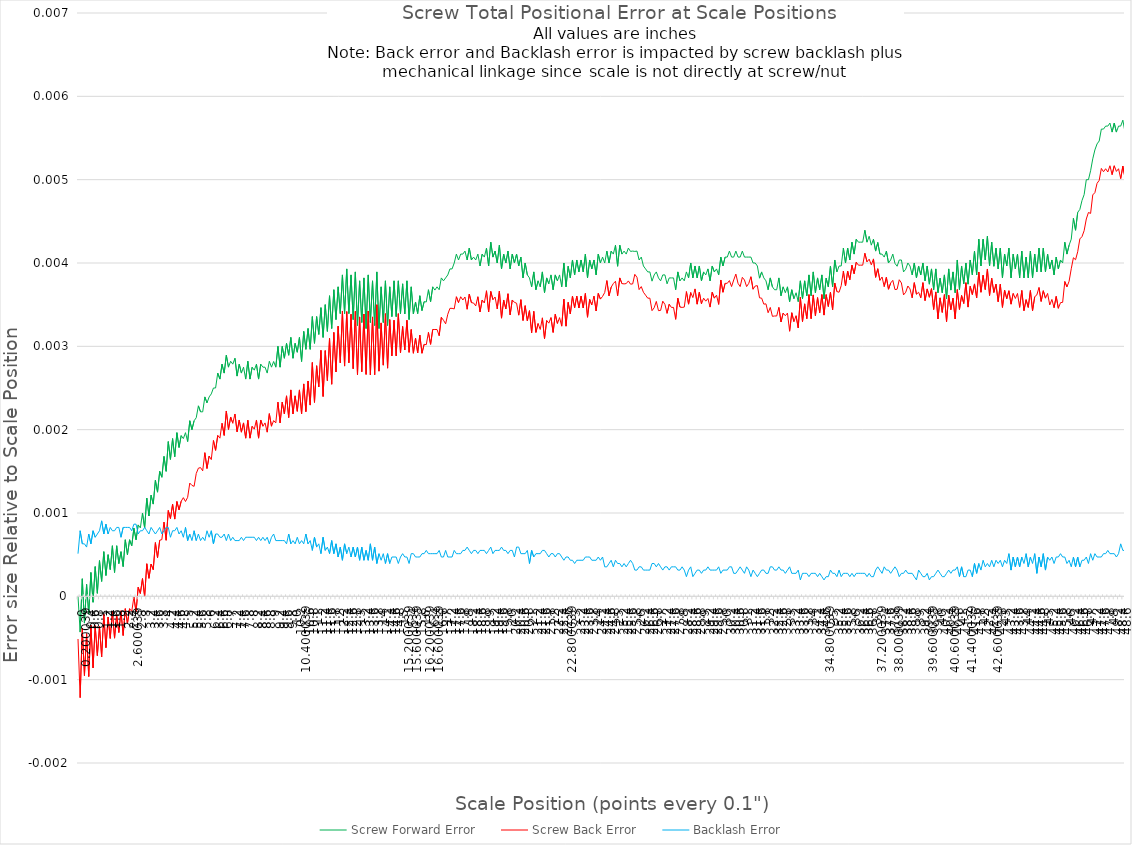
| Category | Screw Forward Error | Screw Back Error | Backlash Error |
|---|---|---|---|
| 0.0 | 0 | -0.001 | 0.001 |
| 0.1 | 0 | -0.001 | 0.001 |
| 0.200039 | 0 | 0 | 0.001 |
| 0.3 | 0 | -0.001 | 0.001 |
| 0.4 | 0 | 0 | 0.001 |
| 0.5 | 0 | -0.001 | 0.001 |
| 0.6 | 0 | 0 | 0.001 |
| 0.7 | 0 | -0.001 | 0.001 |
| 0.8 | 0 | 0 | 0.001 |
| 0.9 | 0 | -0.001 | 0.001 |
| 1.0 | 0 | 0 | 0.001 |
| 1.1 | 0 | -0.001 | 0.001 |
| 1.2 | 0.001 | 0 | 0.001 |
| 1.3 | 0 | -0.001 | 0.001 |
| 1.4 | 0 | 0 | 0.001 |
| 1.5 | 0 | -0.001 | 0.001 |
| 1.6 | 0.001 | 0 | 0.001 |
| 1.7 | 0 | -0.001 | 0.001 |
| 1.8 | 0.001 | 0 | 0.001 |
| 1.9 | 0 | 0 | 0.001 |
| 2.0 | 0.001 | 0 | 0.001 |
| 2.1 | 0 | 0 | 0.001 |
| 2.2 | 0.001 | 0 | 0.001 |
| 2.3 | 0 | 0 | 0.001 |
| 2.4 | 0.001 | 0 | 0.001 |
| 2.5 | 0.001 | 0 | 0.001 |
| 2.600039 | 0.001 | 0 | 0.001 |
| 2.7 | 0.001 | 0 | 0.001 |
| 2.8 | 0.001 | 0 | 0.001 |
| 2.9 | 0.001 | 0 | 0.001 |
| 3.0 | 0.001 | 0 | 0.001 |
| 3.1 | 0.001 | 0 | 0.001 |
| 3.2 | 0.001 | 0 | 0.001 |
| 3.3 | 0.001 | 0 | 0.001 |
| 3.4 | 0.001 | 0 | 0.001 |
| 3.5 | 0.001 | 0 | 0.001 |
| 3.6 | 0.001 | 0.001 | 0.001 |
| 3.7 | 0.001 | 0 | 0.001 |
| 3.8 | 0.002 | 0.001 | 0.001 |
| 3.9 | 0.001 | 0.001 | 0.001 |
| 4.0 | 0.002 | 0.001 | 0.001 |
| 4.1 | 0.002 | 0.001 | 0.001 |
| 4.2 | 0.002 | 0.001 | 0.001 |
| 4.3 | 0.002 | 0.001 | 0.001 |
| 4.4 | 0.002 | 0.001 | 0.001 |
| 4.500039 | 0.002 | 0.001 | 0.001 |
| 4.6 | 0.002 | 0.001 | 0.001 |
| 4.7 | 0.002 | 0.001 | 0.001 |
| 4.8 | 0.002 | 0.001 | 0.001 |
| 4.9 | 0.002 | 0.001 | 0.001 |
| 5.0 | 0.002 | 0.001 | 0.001 |
| 5.1 | 0.002 | 0.001 | 0.001 |
| 5.2 | 0.002 | 0.001 | 0.001 |
| 5.3 | 0.002 | 0.001 | 0.001 |
| 5.4 | 0.002 | 0.001 | 0.001 |
| 5.5 | 0.002 | 0.001 | 0.001 |
| 5.6 | 0.002 | 0.002 | 0.001 |
| 5.7 | 0.002 | 0.002 | 0.001 |
| 5.8 | 0.002 | 0.002 | 0.001 |
| 5.9 | 0.002 | 0.002 | 0.001 |
| 6.0 | 0.002 | 0.002 | 0.001 |
| 6.1 | 0.002 | 0.002 | 0.001 |
| 6.2 | 0.002 | 0.002 | 0.001 |
| 6.3 | 0.002 | 0.002 | 0.001 |
| 6.4 | 0.002 | 0.002 | 0.001 |
| 6.5 | 0.003 | 0.002 | 0.001 |
| 6.6 | 0.003 | 0.002 | 0.001 |
| 6.7 | 0.003 | 0.002 | 0.001 |
| 6.8 | 0.003 | 0.002 | 0.001 |
| 6.9 | 0.003 | 0.002 | 0.001 |
| 7.0 | 0.003 | 0.002 | 0.001 |
| 7.1 | 0.003 | 0.002 | 0.001 |
| 7.2 | 0.003 | 0.002 | 0.001 |
| 7.3 | 0.003 | 0.002 | 0.001 |
| 7.4 | 0.003 | 0.002 | 0.001 |
| 7.5 | 0.003 | 0.002 | 0.001 |
| 7.6 | 0.003 | 0.002 | 0.001 |
| 7.7 | 0.003 | 0.002 | 0.001 |
| 7.8 | 0.003 | 0.002 | 0.001 |
| 7.9 | 0.003 | 0.002 | 0.001 |
| 8.0 | 0.003 | 0.002 | 0.001 |
| 8.1 | 0.003 | 0.002 | 0.001 |
| 8.2 | 0.003 | 0.002 | 0.001 |
| 8.3 | 0.003 | 0.002 | 0.001 |
| 8.4 | 0.003 | 0.002 | 0.001 |
| 8.5 | 0.003 | 0.002 | 0.001 |
| 8.6 | 0.003 | 0.002 | 0.001 |
| 8.7 | 0.003 | 0.002 | 0.001 |
| 8.8 | 0.003 | 0.002 | 0.001 |
| 8.9 | 0.003 | 0.002 | 0.001 |
| 9.0 | 0.003 | 0.002 | 0.001 |
| 9.100039 | 0.003 | 0.002 | 0.001 |
| 9.2 | 0.003 | 0.002 | 0.001 |
| 9.3 | 0.003 | 0.002 | 0.001 |
| 9.4 | 0.003 | 0.002 | 0.001 |
| 9.5 | 0.003 | 0.002 | 0.001 |
| 9.6 | 0.003 | 0.002 | 0.001 |
| 9.7 | 0.003 | 0.002 | 0.001 |
| 9.8 | 0.003 | 0.002 | 0.001 |
| 9.9 | 0.003 | 0.002 | 0.001 |
| 10.0 | 0.003 | 0.002 | 0.001 |
| 10.1 | 0.003 | 0.002 | 0.001 |
| 10.2 | 0.003 | 0.002 | 0.001 |
| 10.3 | 0.003 | 0.002 | 0.001 |
| 10.400039 | 0.003 | 0.002 | 0.001 |
| 10.5 | 0.003 | 0.003 | 0.001 |
| 10.6 | 0.003 | 0.002 | 0.001 |
| 10.7 | 0.003 | 0.003 | 0.001 |
| 10.8 | 0.003 | 0.002 | 0.001 |
| 10.9 | 0.003 | 0.003 | 0.001 |
| 11.0 | 0.003 | 0.002 | 0.001 |
| 11.1 | 0.003 | 0.003 | 0.001 |
| 11.2 | 0.003 | 0.003 | 0.001 |
| 11.3 | 0.003 | 0.003 | 0.001 |
| 11.4 | 0.003 | 0.002 | 0.001 |
| 11.5 | 0.004 | 0.003 | 0.001 |
| 11.6 | 0.003 | 0.003 | 0.001 |
| 11.7 | 0.004 | 0.003 | 0.001 |
| 11.8 | 0.003 | 0.003 | 0.001 |
| 11.9 | 0.004 | 0.003 | 0.001 |
| 12.0 | 0.003 | 0.003 | 0.001 |
| 12.1 | 0.004 | 0.003 | 0 |
| 12.2 | 0.003 | 0.003 | 0.001 |
| 12.3 | 0.004 | 0.003 | 0 |
| 12.4 | 0.003 | 0.003 | 0.001 |
| 12.5 | 0.004 | 0.003 | 0.001 |
| 12.6 | 0.003 | 0.003 | 0.001 |
| 12.7 | 0.004 | 0.003 | 0 |
| 12.8 | 0.003 | 0.003 | 0.001 |
| 12.9 | 0.004 | 0.003 | 0 |
| 13.0 | 0.003 | 0.003 | 0.001 |
| 13.1 | 0.004 | 0.003 | 0 |
| 13.2 | 0.003 | 0.003 | 0.001 |
| 13.3 | 0.004 | 0.003 | 0 |
| 13.4 | 0.003 | 0.003 | 0.001 |
| 13.5 | 0.004 | 0.003 | 0 |
| 13.6 | 0.003 | 0.003 | 0.001 |
| 13.7 | 0.004 | 0.003 | 0 |
| 13.8 | 0.003 | 0.003 | 0.001 |
| 13.9 | 0.004 | 0.003 | 0 |
| 14.0 | 0.003 | 0.003 | 0.001 |
| 14.1 | 0.004 | 0.003 | 0 |
| 14.2 | 0.003 | 0.003 | 0.001 |
| 14.3 | 0.004 | 0.003 | 0 |
| 14.4 | 0.003 | 0.003 | 0.001 |
| 14.5 | 0.004 | 0.003 | 0 |
| 14.6 | 0.003 | 0.003 | 0 |
| 14.7 | 0.004 | 0.003 | 0 |
| 14.8 | 0.003 | 0.003 | 0 |
| 14.9 | 0.004 | 0.003 | 0 |
| 15.0 | 0.003 | 0.003 | 0 |
| 15.1 | 0.004 | 0.003 | 0.001 |
| 15.200039 | 0.003 | 0.003 | 0 |
| 15.3 | 0.004 | 0.003 | 0 |
| 15.4 | 0.003 | 0.003 | 0 |
| 15.5 | 0.004 | 0.003 | 0.001 |
| 15.600039 | 0.003 | 0.003 | 0.001 |
| 15.700039 | 0.004 | 0.003 | 0 |
| 15.8 | 0.003 | 0.003 | 0 |
| 15.9 | 0.004 | 0.003 | 0 |
| 16.0 | 0.003 | 0.003 | 0.001 |
| 16.1 | 0.004 | 0.003 | 0.001 |
| 16.200039 | 0.004 | 0.003 | 0.001 |
| 16.3 | 0.004 | 0.003 | 0.001 |
| 16.4 | 0.004 | 0.003 | 0.001 |
| 16.5 | 0.004 | 0.003 | 0.001 |
| 16.600039 | 0.004 | 0.003 | 0.001 |
| 16.7 | 0.004 | 0.003 | 0.001 |
| 16.8 | 0.004 | 0.003 | 0.001 |
| 16.9 | 0.004 | 0.003 | 0 |
| 17.0 | 0.004 | 0.003 | 0 |
| 17.1 | 0.004 | 0.003 | 0.001 |
| 17.2 | 0.004 | 0.003 | 0 |
| 17.3 | 0.004 | 0.003 | 0 |
| 17.4 | 0.004 | 0.003 | 0 |
| 17.5 | 0.004 | 0.003 | 0.001 |
| 17.6 | 0.004 | 0.004 | 0.001 |
| 17.7 | 0.004 | 0.004 | 0.001 |
| 17.8 | 0.004 | 0.004 | 0.001 |
| 17.9 | 0.004 | 0.004 | 0.001 |
| 18.0 | 0.004 | 0.004 | 0.001 |
| 18.1 | 0.004 | 0.003 | 0.001 |
| 18.2 | 0.004 | 0.004 | 0.001 |
| 18.3 | 0.004 | 0.004 | 0.001 |
| 18.4 | 0.004 | 0.004 | 0.001 |
| 18.5 | 0.004 | 0.003 | 0.001 |
| 18.6 | 0.004 | 0.004 | 0.001 |
| 18.7 | 0.004 | 0.003 | 0.001 |
| 18.8 | 0.004 | 0.004 | 0.001 |
| 18.9 | 0.004 | 0.004 | 0.001 |
| 19.0 | 0.004 | 0.004 | 0.001 |
| 19.1 | 0.004 | 0.003 | 0.001 |
| 19.2 | 0.004 | 0.004 | 0.001 |
| 19.3 | 0.004 | 0.004 | 0.001 |
| 19.4 | 0.004 | 0.004 | 0.001 |
| 19.5 | 0.004 | 0.003 | 0.001 |
| 19.6 | 0.004 | 0.004 | 0.001 |
| 19.7 | 0.004 | 0.003 | 0.001 |
| 19.8 | 0.004 | 0.004 | 0.001 |
| 19.9 | 0.004 | 0.003 | 0.001 |
| 20.0 | 0.004 | 0.004 | 0.001 |
| 20.1 | 0.004 | 0.003 | 0.001 |
| 20.2 | 0.004 | 0.004 | 0.001 |
| 20.3 | 0.004 | 0.004 | 0 |
| 20.4 | 0.004 | 0.004 | 0.001 |
| 20.5 | 0.004 | 0.003 | 0.001 |
| 20.6 | 0.004 | 0.004 | 0.001 |
| 20.7 | 0.004 | 0.003 | 0.001 |
| 20.8 | 0.004 | 0.003 | 0.001 |
| 20.9 | 0.004 | 0.003 | 0.001 |
| 21.0 | 0.004 | 0.003 | 0 |
| 21.1 | 0.004 | 0.003 | 0.001 |
| 21.2 | 0.004 | 0.003 | 0 |
| 21.3 | 0.004 | 0.003 | 0.001 |
| 21.4 | 0.004 | 0.003 | 0.001 |
| 21.5 | 0.004 | 0.003 | 0.001 |
| 21.6 | 0.004 | 0.003 | 0.001 |
| 21.7 | 0.004 | 0.003 | 0.001 |
| 21.8 | 0.004 | 0.003 | 0.001 |
| 21.9 | 0.004 | 0.003 | 0 |
| 22.0 | 0.004 | 0.003 | 0.001 |
| 22.1 | 0.004 | 0.003 | 0.001 |
| 22.2 | 0.004 | 0.003 | 0 |
| 22.3 | 0.004 | 0.003 | 0.001 |
| 22.4 | 0.004 | 0.003 | 0.001 |
| 22.5 | 0.004 | 0.003 | 0 |
| 22.6 | 0.004 | 0.004 | 0 |
| 22.7 | 0.004 | 0.003 | 0 |
| 22.800039 | 0.004 | 0.004 | 0 |
| 22.9 | 0.004 | 0.003 | 0 |
| 23.0 | 0.004 | 0.004 | 0 |
| 23.1 | 0.004 | 0.003 | 0 |
| 23.2 | 0.004 | 0.004 | 0 |
| 23.3 | 0.004 | 0.003 | 0 |
| 23.4 | 0.004 | 0.004 | 0 |
| 23.5 | 0.004 | 0.003 | 0 |
| 23.6 | 0.004 | 0.004 | 0 |
| 23.7 | 0.004 | 0.003 | 0 |
| 23.8 | 0.004 | 0.004 | 0 |
| 23.9 | 0.004 | 0.003 | 0 |
| 24.0 | 0.004 | 0.004 | 0 |
| 24.1 | 0.004 | 0.003 | 0 |
| 24.2 | 0.004 | 0.004 | 0 |
| 24.3 | 0.004 | 0.004 | 0 |
| 24.4 | 0.004 | 0.004 | 0 |
| 24.5 | 0.004 | 0.004 | 0 |
| 24.6 | 0.004 | 0.004 | 0 |
| 24.7 | 0.004 | 0.004 | 0 |
| 24.8 | 0.004 | 0.004 | 0 |
| 24.9 | 0.004 | 0.004 | 0 |
| 25.0 | 0.004 | 0.004 | 0 |
| 25.100039 | 0.004 | 0.004 | 0 |
| 25.2 | 0.004 | 0.004 | 0 |
| 25.3 | 0.004 | 0.004 | 0 |
| 25.4 | 0.004 | 0.004 | 0 |
| 25.5 | 0.004 | 0.004 | 0 |
| 25.6 | 0.004 | 0.004 | 0 |
| 25.700039 | 0.004 | 0.004 | 0 |
| 25.8 | 0.004 | 0.004 | 0 |
| 25.900039 | 0.004 | 0.004 | 0 |
| 26.0 | 0.004 | 0.004 | 0 |
| 26.1 | 0.004 | 0.004 | 0 |
| 26.2 | 0.004 | 0.004 | 0 |
| 26.3 | 0.004 | 0.004 | 0 |
| 26.4 | 0.004 | 0.004 | 0 |
| 26.5 | 0.004 | 0.004 | 0 |
| 26.6 | 0.004 | 0.004 | 0 |
| 26.700039 | 0.004 | 0.003 | 0 |
| 26.8 | 0.004 | 0.003 | 0 |
| 26.9 | 0.004 | 0.004 | 0 |
| 27.0 | 0.004 | 0.003 | 0 |
| 27.1 | 0.004 | 0.003 | 0 |
| 27.2 | 0.004 | 0.004 | 0 |
| 27.3 | 0.004 | 0.004 | 0 |
| 27.4 | 0.004 | 0.003 | 0 |
| 27.5 | 0.004 | 0.004 | 0 |
| 27.6 | 0.004 | 0.003 | 0 |
| 27.7 | 0.004 | 0.003 | 0 |
| 27.8 | 0.004 | 0.003 | 0 |
| 27.9 | 0.004 | 0.004 | 0 |
| 28.0 | 0.004 | 0.003 | 0 |
| 28.1 | 0.004 | 0.003 | 0 |
| 28.2 | 0.004 | 0.003 | 0 |
| 28.3 | 0.004 | 0.004 | 0 |
| 28.4 | 0.004 | 0.004 | 0 |
| 28.5 | 0.004 | 0.004 | 0 |
| 28.6 | 0.004 | 0.004 | 0 |
| 28.7 | 0.004 | 0.004 | 0 |
| 28.8 | 0.004 | 0.004 | 0 |
| 28.9 | 0.004 | 0.004 | 0 |
| 29.0 | 0.004 | 0.004 | 0 |
| 29.1 | 0.004 | 0.004 | 0 |
| 29.2 | 0.004 | 0.004 | 0 |
| 29.3 | 0.004 | 0.004 | 0 |
| 29.4 | 0.004 | 0.003 | 0 |
| 29.5 | 0.004 | 0.004 | 0 |
| 29.6 | 0.004 | 0.004 | 0 |
| 29.7 | 0.004 | 0.004 | 0 |
| 29.8 | 0.004 | 0.004 | 0 |
| 29.9 | 0.004 | 0.004 | 0 |
| 30.0 | 0.004 | 0.004 | 0 |
| 30.1 | 0.004 | 0.004 | 0 |
| 30.2 | 0.004 | 0.004 | 0 |
| 30.3 | 0.004 | 0.004 | 0 |
| 30.4 | 0.004 | 0.004 | 0 |
| 30.5 | 0.004 | 0.004 | 0 |
| 30.6 | 0.004 | 0.004 | 0 |
| 30.7 | 0.004 | 0.004 | 0 |
| 30.8 | 0.004 | 0.004 | 0 |
| 30.9 | 0.004 | 0.004 | 0 |
| 31.0 | 0.004 | 0.004 | 0 |
| 31.1 | 0.004 | 0.004 | 0 |
| 31.2 | 0.004 | 0.004 | 0 |
| 31.3 | 0.004 | 0.004 | 0 |
| 31.4 | 0.004 | 0.004 | 0 |
| 31.5 | 0.004 | 0.004 | 0 |
| 31.6 | 0.004 | 0.004 | 0 |
| 31.700039 | 0.004 | 0.004 | 0 |
| 31.8 | 0.004 | 0.004 | 0 |
| 31.9 | 0.004 | 0.004 | 0 |
| 32.0 | 0.004 | 0.004 | 0 |
| 32.1 | 0.004 | 0.003 | 0 |
| 32.2 | 0.004 | 0.003 | 0 |
| 32.3 | 0.004 | 0.003 | 0 |
| 32.4 | 0.004 | 0.003 | 0 |
| 32.5 | 0.004 | 0.003 | 0 |
| 32.6 | 0.004 | 0.003 | 0 |
| 32.7 | 0.004 | 0.003 | 0 |
| 32.8 | 0.004 | 0.003 | 0 |
| 32.9 | 0.004 | 0.003 | 0 |
| 33.0 | 0.004 | 0.003 | 0 |
| 33.1 | 0.004 | 0.003 | 0 |
| 33.2 | 0.004 | 0.003 | 0 |
| 33.3 | 0.004 | 0.003 | 0 |
| 33.4 | 0.004 | 0.003 | 0 |
| 33.5 | 0.004 | 0.003 | 0 |
| 33.6 | 0.004 | 0.004 | 0 |
| 33.7 | 0.004 | 0.003 | 0 |
| 33.8 | 0.004 | 0.004 | 0 |
| 33.9 | 0.004 | 0.003 | 0 |
| 34.0 | 0.004 | 0.004 | 0 |
| 34.1 | 0.004 | 0.003 | 0 |
| 34.2 | 0.004 | 0.004 | 0 |
| 34.3 | 0.004 | 0.003 | 0 |
| 34.4 | 0.004 | 0.004 | 0 |
| 34.5 | 0.004 | 0.003 | 0 |
| 34.6 | 0.004 | 0.004 | 0 |
| 34.7 | 0.004 | 0.003 | 0 |
| 34.800039 | 0.004 | 0.004 | 0 |
| 34.9 | 0.004 | 0.003 | 0 |
| 35.0 | 0.004 | 0.004 | 0 |
| 35.1 | 0.004 | 0.003 | 0 |
| 35.2 | 0.004 | 0.004 | 0 |
| 35.3 | 0.004 | 0.004 | 0 |
| 35.4 | 0.004 | 0.004 | 0 |
| 35.5 | 0.004 | 0.004 | 0 |
| 35.6 | 0.004 | 0.004 | 0 |
| 35.7 | 0.004 | 0.004 | 0 |
| 35.8 | 0.004 | 0.004 | 0 |
| 35.9 | 0.004 | 0.004 | 0 |
| 36.0 | 0.004 | 0.004 | 0 |
| 36.1 | 0.004 | 0.004 | 0 |
| 36.2 | 0.004 | 0.004 | 0 |
| 36.3 | 0.004 | 0.004 | 0 |
| 36.4 | 0.004 | 0.004 | 0 |
| 36.5 | 0.004 | 0.004 | 0 |
| 36.6 | 0.004 | 0.004 | 0 |
| 36.7 | 0.004 | 0.004 | 0 |
| 36.8 | 0.004 | 0.004 | 0 |
| 36.9 | 0.004 | 0.004 | 0 |
| 37.0 | 0.004 | 0.004 | 0 |
| 37.1 | 0.004 | 0.004 | 0 |
| 37.200039 | 0.004 | 0.004 | 0 |
| 37.3 | 0.004 | 0.004 | 0 |
| 37.4 | 0.004 | 0.004 | 0 |
| 37.5 | 0.004 | 0.004 | 0 |
| 37.6 | 0.004 | 0.004 | 0 |
| 37.7 | 0.004 | 0.004 | 0 |
| 37.8 | 0.004 | 0.004 | 0 |
| 37.9 | 0.004 | 0.004 | 0 |
| 38.000039 | 0.004 | 0.004 | 0 |
| 38.100039 | 0.004 | 0.004 | 0 |
| 38.2 | 0.004 | 0.004 | 0 |
| 38.3 | 0.004 | 0.004 | 0 |
| 38.4 | 0.004 | 0.004 | 0 |
| 38.500039 | 0.004 | 0.004 | 0 |
| 38.6 | 0.004 | 0.004 | 0 |
| 38.7 | 0.004 | 0.004 | 0 |
| 38.8 | 0.004 | 0.004 | 0 |
| 38.9 | 0.004 | 0.004 | 0 |
| 39.0 | 0.004 | 0.004 | 0 |
| 39.1 | 0.004 | 0.004 | 0 |
| 39.2 | 0.004 | 0.004 | 0 |
| 39.3 | 0.004 | 0.004 | 0 |
| 39.4 | 0.004 | 0.004 | 0 |
| 39.5 | 0.004 | 0.004 | 0 |
| 39.600039 | 0.004 | 0.004 | 0 |
| 39.7 | 0.004 | 0.004 | 0 |
| 39.8 | 0.004 | 0.003 | 0 |
| 39.9 | 0.004 | 0.004 | 0 |
| 40.0 | 0.004 | 0.003 | 0 |
| 40.100039 | 0.004 | 0.004 | 0 |
| 40.2 | 0.004 | 0.003 | 0 |
| 40.3 | 0.004 | 0.004 | 0 |
| 40.4 | 0.004 | 0.003 | 0 |
| 40.5 | 0.004 | 0.004 | 0 |
| 40.600039 | 0.004 | 0.003 | 0 |
| 40.7 | 0.004 | 0.004 | 0 |
| 40.8 | 0.004 | 0.003 | 0 |
| 40.9 | 0.004 | 0.004 | 0 |
| 41.0 | 0.004 | 0.003 | 0 |
| 41.1 | 0.004 | 0.004 | 0 |
| 41.2 | 0.004 | 0.004 | 0 |
| 41.3 | 0.004 | 0.004 | 0 |
| 41.400039 | 0.004 | 0.003 | 0 |
| 41.5 | 0.004 | 0.004 | 0 |
| 41.6 | 0.004 | 0.004 | 0 |
| 41.7 | 0.004 | 0.004 | 0 |
| 41.8 | 0.004 | 0.004 | 0 |
| 41.9 | 0.004 | 0.004 | 0 |
| 42.0 | 0.004 | 0.004 | 0 |
| 42.1 | 0.004 | 0.004 | 0 |
| 42.2 | 0.004 | 0.004 | 0 |
| 42.3 | 0.004 | 0.004 | 0 |
| 42.4 | 0.004 | 0.004 | 0 |
| 42.5 | 0.004 | 0.004 | 0 |
| 42.600039 | 0.004 | 0.004 | 0 |
| 42.7 | 0.004 | 0.004 | 0 |
| 42.8 | 0.004 | 0.004 | 0 |
| 42.9 | 0.004 | 0.004 | 0 |
| 43.0 | 0.004 | 0.003 | 0 |
| 43.1 | 0.004 | 0.004 | 0 |
| 43.2 | 0.004 | 0.004 | 0 |
| 43.3 | 0.004 | 0.004 | 0.001 |
| 43.4 | 0.004 | 0.004 | 0 |
| 43.5 | 0.004 | 0.004 | 0 |
| 43.6 | 0.004 | 0.004 | 0 |
| 43.7 | 0.004 | 0.004 | 0 |
| 43.8 | 0.004 | 0.003 | 0 |
| 43.9 | 0.004 | 0.004 | 0 |
| 44.0 | 0.004 | 0.003 | 0 |
| 44.1 | 0.004 | 0.004 | 0.001 |
| 44.2 | 0.004 | 0.003 | 0 |
| 44.3 | 0.004 | 0.004 | 0 |
| 44.4 | 0.004 | 0.003 | 0 |
| 44.5 | 0.004 | 0.004 | 0.001 |
| 44.6 | 0.004 | 0.004 | 0 |
| 44.7 | 0.004 | 0.004 | 0 |
| 44.8 | 0.004 | 0.004 | 0 |
| 44.9 | 0.004 | 0.004 | 0.001 |
| 45.0 | 0.004 | 0.004 | 0 |
| 45.1 | 0.004 | 0.004 | 0 |
| 45.2 | 0.004 | 0.003 | 0 |
| 45.3 | 0.004 | 0.004 | 0 |
| 45.4 | 0.004 | 0.003 | 0 |
| 45.5 | 0.004 | 0.004 | 0 |
| 45.6 | 0.004 | 0.003 | 0 |
| 45.7 | 0.004 | 0.004 | 0.001 |
| 45.8 | 0.004 | 0.004 | 0 |
| 45.9 | 0.004 | 0.004 | 0 |
| 46.0 | 0.004 | 0.004 | 0 |
| 46.1 | 0.004 | 0.004 | 0 |
| 46.2 | 0.004 | 0.004 | 0 |
| 46.3 | 0.005 | 0.004 | 0 |
| 46.4 | 0.004 | 0.004 | 0 |
| 46.5 | 0.005 | 0.004 | 0 |
| 46.6 | 0.005 | 0.004 | 0 |
| 46.7 | 0.005 | 0.004 | 0 |
| 46.8 | 0.005 | 0.004 | 0 |
| 46.9 | 0.005 | 0.005 | 0 |
| 47.0 | 0.005 | 0.005 | 0 |
| 47.1 | 0.005 | 0.005 | 0.001 |
| 47.2 | 0.005 | 0.005 | 0 |
| 47.3 | 0.005 | 0.005 | 0.001 |
| 47.4 | 0.005 | 0.005 | 0 |
| 47.5 | 0.005 | 0.005 | 0 |
| 47.6 | 0.006 | 0.005 | 0 |
| 47.7 | 0.006 | 0.005 | 0.001 |
| 47.8 | 0.006 | 0.005 | 0.001 |
| 47.9 | 0.006 | 0.005 | 0.001 |
| 48.0 | 0.006 | 0.005 | 0.001 |
| 48.1 | 0.006 | 0.005 | 0.001 |
| 48.2 | 0.006 | 0.005 | 0.001 |
| 48.3 | 0.006 | 0.005 | 0 |
| 48.4 | 0.006 | 0.005 | 0.001 |
| 48.5 | 0.006 | 0.005 | 0.001 |
| 48.6 | 0.006 | 0.005 | 0.001 |
| 48.7 | 0.006 | 0.005 | 0.001 |